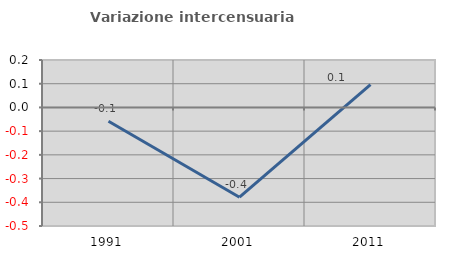
| Category | Variazione intercensuaria annua |
|---|---|
| 1991.0 | -0.059 |
| 2001.0 | -0.379 |
| 2011.0 | 0.096 |